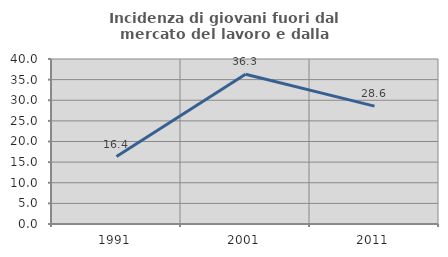
| Category | Incidenza di giovani fuori dal mercato del lavoro e dalla formazione  |
|---|---|
| 1991.0 | 16.364 |
| 2001.0 | 36.301 |
| 2011.0 | 28.571 |